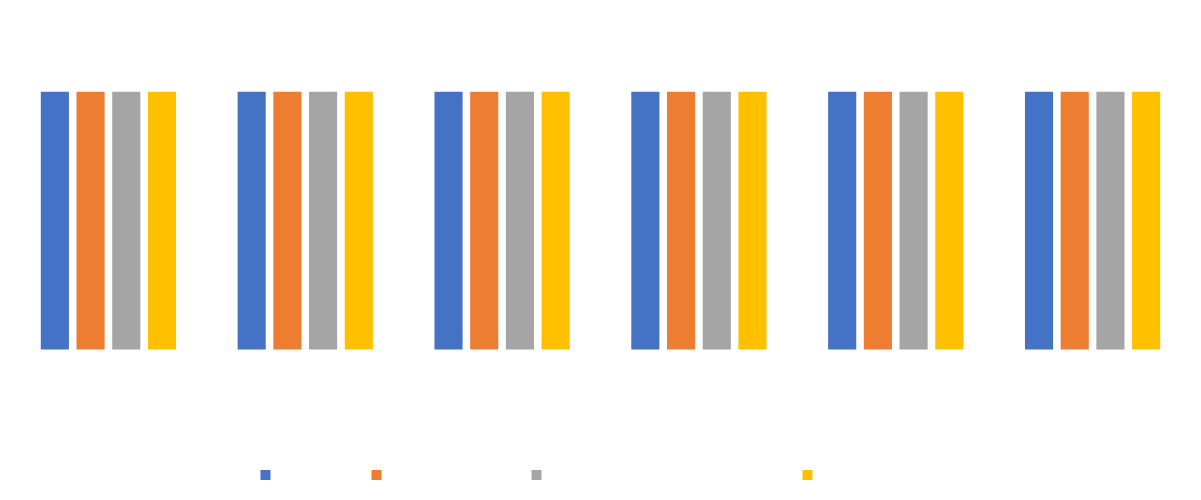
| Category | Students | Teaching staff | Professional services staff | Researchers |
|---|---|---|---|---|
| No suitable computer/device | 0.5 | 0.5 | 0.5 | 0.5 |
| No safe, private area to work | 0.5 | 0.5 | 0.5 | 0.5 |
| Poor wifi connection | 0.5 | 0.5 | 0.5 | 0.5 |
| Mobile data costs | 0.5 | 0.5 | 0.5 | 0.5 |
| Can't access [learning/teaching platforms] [work/research systems you need] | 0.5 | 0.5 | 0.5 | 0.5 |
| None of these | 0.5 | 0.5 | 0.5 | 0.5 |